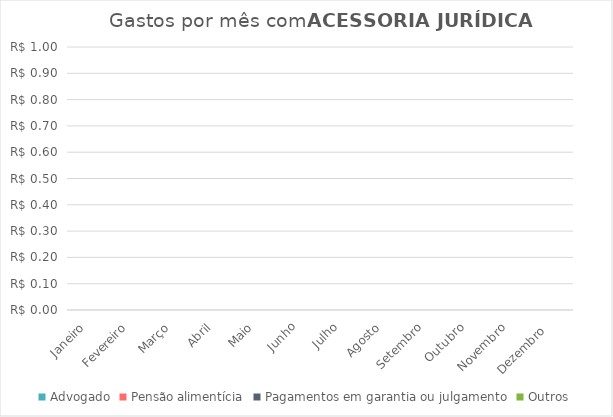
| Category | Advogado | Pensão alimentícia | Pagamentos em garantia ou julgamento | Outros |
|---|---|---|---|---|
| Janeiro | 0 | 0 | 0 | 0 |
| Fevereiro | 0 | 0 | 0 | 0 |
| Março | 0 | 0 | 0 | 0 |
| Abril | 0 | 0 | 0 | 0 |
| Maio | 0 | 0 | 0 | 0 |
| Junho | 0 | 0 | 0 | 0 |
| Julho | 0 | 0 | 0 | 0 |
| Agosto | 0 | 0 | 0 | 0 |
| Setembro | 0 | 0 | 0 | 0 |
| Outubro | 0 | 0 | 0 | 0 |
| Novembro | 0 | 0 | 0 | 0 |
| Dezembro  | 0 | 0 | 0 | 0 |